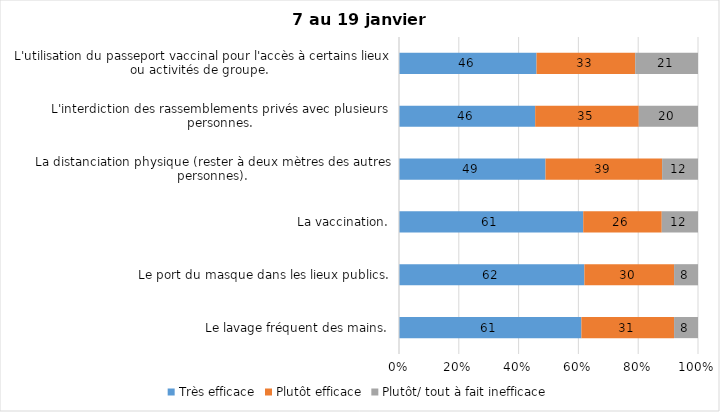
| Category | Très efficace | Plutôt efficace | Plutôt/ tout à fait inefficace |
|---|---|---|---|
| Le lavage fréquent des mains. | 61 | 31 | 8 |
| Le port du masque dans les lieux publics. | 62 | 30 | 8 |
| La vaccination. | 61 | 26 | 12 |
| La distanciation physique (rester à deux mètres des autres personnes). | 49 | 39 | 12 |
| L'interdiction des rassemblements privés avec plusieurs personnes. | 46 | 35 | 20 |
| L'utilisation du passeport vaccinal pour l'accès à certains lieux ou activités de groupe.  | 46 | 33 | 21 |